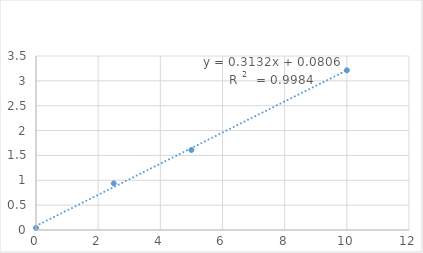
| Category | Series 0 |
|---|---|
| 0.0 | 0.043 |
| 2.5 | 0.939 |
| 5.0 | 1.609 |
| 10.0 | 3.212 |